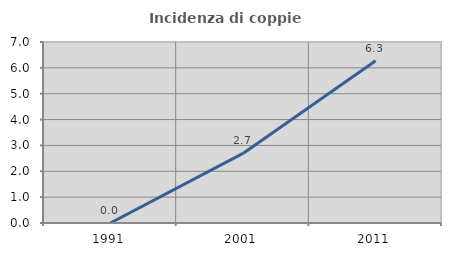
| Category | Incidenza di coppie miste |
|---|---|
| 1991.0 | 0 |
| 2001.0 | 2.691 |
| 2011.0 | 6.276 |